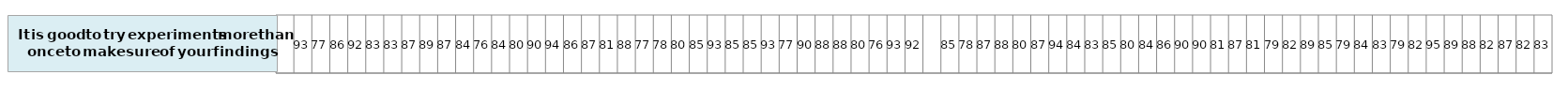
| Category | It is good to try experiments 
more than once to make sure 
of your findings |
|---|---|
| nan | 1 |
| 92.981340251252 | 1 |
| 76.95387217863784 | 1 |
| 86.15699701403337 | 1 |
| 91.55689406685387 | 1 |
| 83.08721726495965 | 1 |
| 83.37138403072494 | 1 |
| 87.25159272290628 | 1 |
| 88.90569978917313 | 1 |
| 86.98860383076916 | 1 |
| 84.17383581330698 | 1 |
| 76.49264955454598 | 1 |
| 84.17182161210818 | 1 |
| 79.99508832572569 | 1 |
| 90.1482372529175 | 1 |
| 93.88985940308243 | 1 |
| 86.09853250258574 | 1 |
| 86.87106475270171 | 1 |
| 81.22050559376297 | 1 |
| 87.53577575058844 | 1 |
| 76.60834546093122 | 1 |
| 78.38123844746396 | 1 |
| 80.21757802433433 | 1 |
| 85.35500455950918 | 1 |
| 92.85014151476267 | 1 |
| 85.29862306509034 | 1 |
| 84.86572791157688 | 1 |
| 93.42572400160502 | 1 |
| 76.74081733409032 | 1 |
| 89.96482209100499 | 1 |
| 87.88077282797427 | 1 |
| 88.19857978561595 | 1 |
| 79.57013605091838 | 1 |
| 75.94571380525461 | 1 |
| 92.67347515837872 | 1 |
| 91.73894630593442 | 1 |
| nan | 1 |
| 85.23724219512236 | 1 |
| 78.36242891801119 | 1 |
| 86.94183155876142 | 1 |
| 88.41083782869717 | 1 |
| 80.22303485285828 | 1 |
| 86.77355833835095 | 1 |
| 93.67746658464674 | 1 |
| 83.99665708417508 | 1 |
| 83.21731222591421 | 1 |
| 84.68127140967229 | 1 |
| 79.5319149913183 | 1 |
| 83.91546450179169 | 1 |
| 85.9586055222144 | 1 |
| 90.1604663602805 | 1 |
| 89.7945042364072 | 1 |
| 80.83106144019058 | 1 |
| 86.78992741465593 | 1 |
| 81.28067127700672 | 1 |
| 79.07901689173923 | 1 |
| 82.33943641554394 | 1 |
| 89.320806525739 | 1 |
| 85.16614468391911 | 1 |
| 78.58993623115424 | 1 |
| 84.3920191321974 | 1 |
| 83.11015957586953 | 1 |
| 79.4746331102152 | 1 |
| 82.02007108275438 | 1 |
| 95.04158650485762 | 1 |
| 89.47590676446114 | 1 |
| 88.17707876395403 | 1 |
| 82.36665596898897 | 1 |
| 86.7370485885254 | 1 |
| 81.98971358844933 | 1 |
| 83.20939964039161 | 1 |